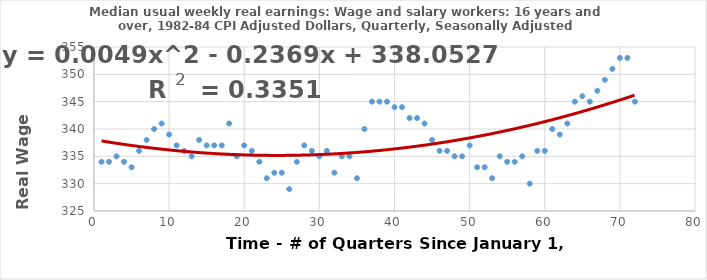
| Category | Series 0 |
|---|---|
| 1.0 | 334 |
| 2.0 | 334 |
| 3.0 | 335 |
| 4.0 | 334 |
| 5.0 | 333 |
| 6.0 | 336 |
| 7.0 | 338 |
| 8.0 | 340 |
| 9.0 | 341 |
| 10.0 | 339 |
| 11.0 | 337 |
| 12.0 | 336 |
| 13.0 | 335 |
| 14.0 | 338 |
| 15.0 | 337 |
| 16.0 | 337 |
| 17.0 | 337 |
| 18.0 | 341 |
| 19.0 | 335 |
| 20.0 | 337 |
| 21.0 | 336 |
| 22.0 | 334 |
| 23.0 | 331 |
| 24.0 | 332 |
| 25.0 | 332 |
| 26.0 | 329 |
| 27.0 | 334 |
| 28.0 | 337 |
| 29.0 | 336 |
| 30.0 | 335 |
| 31.0 | 336 |
| 32.0 | 332 |
| 33.0 | 335 |
| 34.0 | 335 |
| 35.0 | 331 |
| 36.0 | 340 |
| 37.0 | 345 |
| 38.0 | 345 |
| 39.0 | 345 |
| 40.0 | 344 |
| 41.0 | 344 |
| 42.0 | 342 |
| 43.0 | 342 |
| 44.0 | 341 |
| 45.0 | 338 |
| 46.0 | 336 |
| 47.0 | 336 |
| 48.0 | 335 |
| 49.0 | 335 |
| 50.0 | 337 |
| 51.0 | 333 |
| 52.0 | 333 |
| 53.0 | 331 |
| 54.0 | 335 |
| 55.0 | 334 |
| 56.0 | 334 |
| 57.0 | 335 |
| 58.0 | 330 |
| 59.0 | 336 |
| 60.0 | 336 |
| 61.0 | 340 |
| 62.0 | 339 |
| 63.0 | 341 |
| 64.0 | 345 |
| 65.0 | 346 |
| 66.0 | 345 |
| 67.0 | 347 |
| 68.0 | 349 |
| 69.0 | 351 |
| 70.0 | 353 |
| 71.0 | 353 |
| 72.0 | 345 |